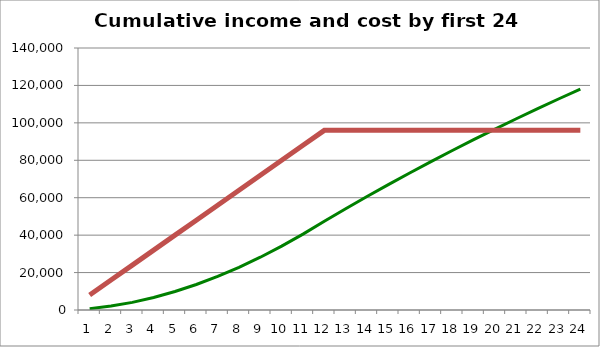
| Category | Series 0 | Series 1 |
|---|---|---|
| 0 | 712.5 | 8000 |
| 1 | 2087.625 | 16000 |
| 2 | 4082.625 | 24000 |
| 3 | 6683.25 | 32000 |
| 4 | 9868.125 | 40000 |
| 5 | 13630.125 | 48000 |
| 6 | 17947.875 | 56000 |
| 7 | 22807.125 | 64000 |
| 8 | 28200.75 | 72000 |
| 9 | 34114.5 | 80000 |
| 10 | 40534.125 | 88000 |
| 11 | 47452.5 | 96000 |
| 12 | 54146.438 | 96000 |
| 13 | 60655.125 | 96000 |
| 14 | 67010.625 | 96000 |
| 15 | 73216.5 | 96000 |
| 16 | 79283.438 | 96000 |
| 17 | 85207.875 | 96000 |
| 18 | 91000.5 | 96000 |
| 19 | 96664.875 | 96000 |
| 20 | 102197.438 | 96000 |
| 21 | 107601.75 | 96000 |
| 22 | 112881.375 | 96000 |
| 23 | 118032.75 | 96000 |